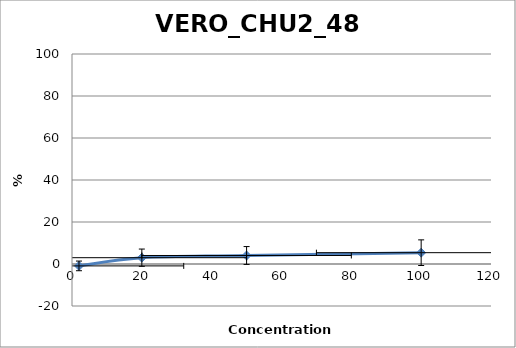
| Category | vero chu2 |
|---|---|
| 100.0 | 5.389 |
| 50.0 | 4.052 |
| 20.0 | 3.005 |
| 2.0 | -0.903 |
| nan | 0 |
| nan | 0 |
| nan | 0 |
| nan | 0 |
| nan | 0 |